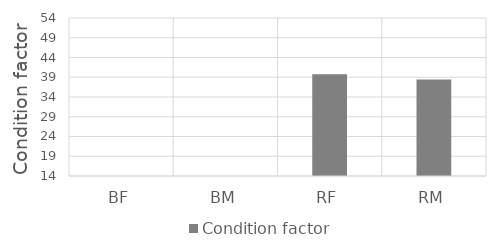
| Category | Condition factor |
|---|---|
| BF | 0 |
| BM | 0 |
| RF | 39.789 |
| RM | 38.425 |